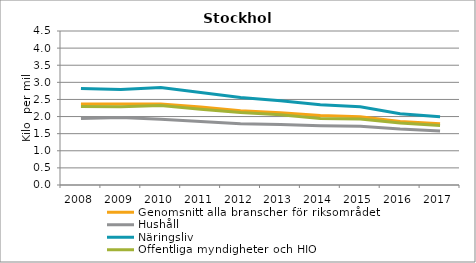
| Category | Genomsnitt alla branscher för riksområdet | Hushåll | Näringsliv | Offentliga myndigheter och HIO |
|---|---|---|---|---|
| 2008 | 2.369 | 1.943 | 2.823 | 2.296 |
| 2009 | 2.366 | 1.973 | 2.789 | 2.286 |
| 2010 | 2.367 | 1.923 | 2.852 | 2.322 |
| 2011 | 2.276 | 1.855 | 2.705 | 2.216 |
| 2012 | 2.168 | 1.789 | 2.554 | 2.119 |
| 2013 | 2.114 | 1.77 | 2.463 | 2.052 |
| 2014 | 2.032 | 1.731 | 2.347 | 1.946 |
| 2015 | 1.994 | 1.717 | 2.283 | 1.928 |
| 2016 | 1.855 | 1.635 | 2.081 | 1.811 |
| 2017 | 1.788 | 1.58 | 1.993 | 1.739 |